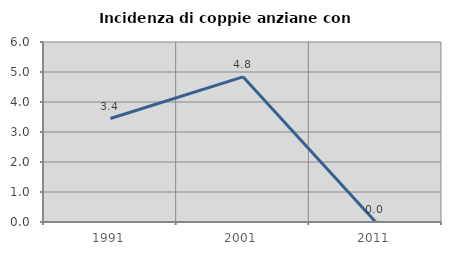
| Category | Incidenza di coppie anziane con figli |
|---|---|
| 1991.0 | 3.448 |
| 2001.0 | 4.839 |
| 2011.0 | 0 |